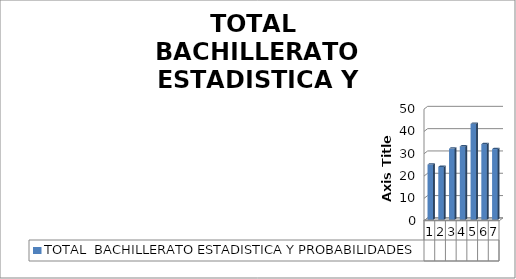
| Category | TOTAL  BACHILLERATO ESTADISTICA Y PROBABILIDADES |
|---|---|
| 0 | 24.84 |
| 1 | 23.8 |
| 2 | 32 |
| 3 | 32.99 |
| 4 | 43.09 |
| 5 | 34 |
| 6 | 31.787 |